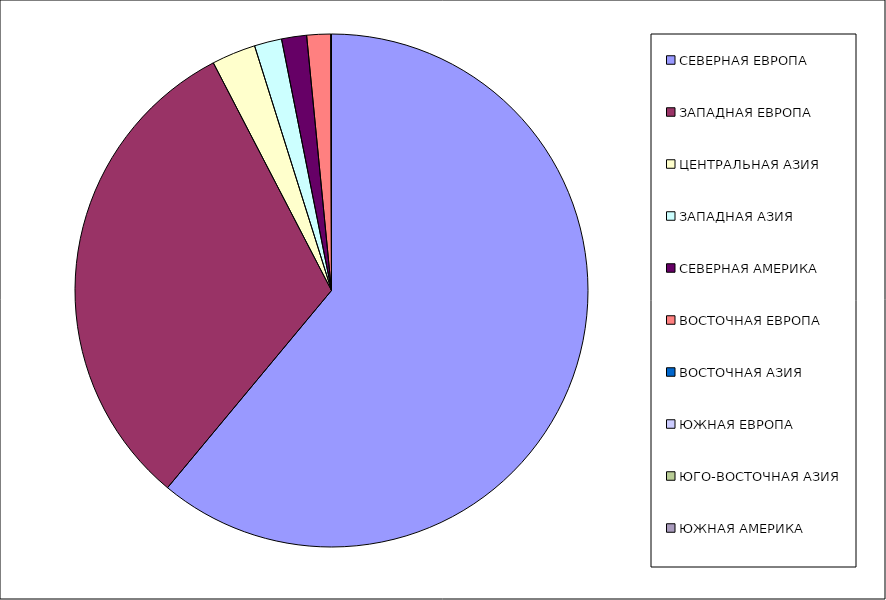
| Category | Оборот |
|---|---|
| СЕВЕРНАЯ ЕВРОПА | 61.039 |
| ЗАПАДНАЯ ЕВРОПА | 31.34 |
| ЦЕНТРАЛЬНАЯ АЗИЯ | 2.772 |
| ЗАПАДНАЯ АЗИЯ | 1.725 |
| СЕВЕРНАЯ АМЕРИКА | 1.575 |
| ВОСТОЧНАЯ ЕВРОПА | 1.504 |
| ВОСТОЧНАЯ АЗИЯ | 0.037 |
| ЮЖНАЯ ЕВРОПА | 0.006 |
| ЮГО-ВОСТОЧНАЯ АЗИЯ | 0.001 |
| ЮЖНАЯ АМЕРИКА | 0 |